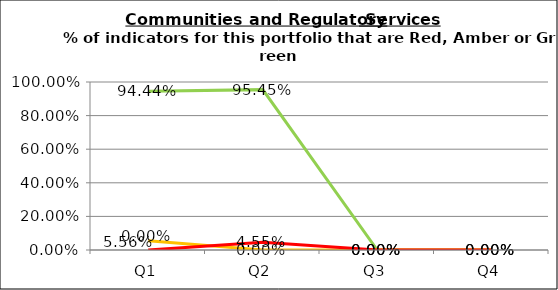
| Category | Green | Amber | Red |
|---|---|---|---|
| Q1 | 0.944 | 0.056 | 0 |
| Q2 | 0.955 | 0 | 0.045 |
| Q3 | 0 | 0 | 0 |
| Q4 | 0 | 0 | 0 |